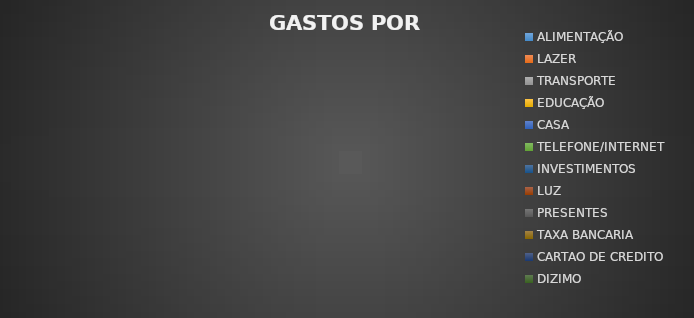
| Category | Series 0 |
|---|---|
| ALIMENTAÇÃO | 0 |
| LAZER | 0 |
| TRANSPORTE | 0 |
| EDUCAÇÃO | 0 |
| CASA | 0 |
| TELEFONE/INTERNET | 0 |
| INVESTIMENTOS | 0 |
| LUZ | 0 |
| PRESENTES | 0 |
| TAXA BANCARIA | 0 |
| CARTAO DE CREDITO | 0 |
| DIZIMO | 0 |